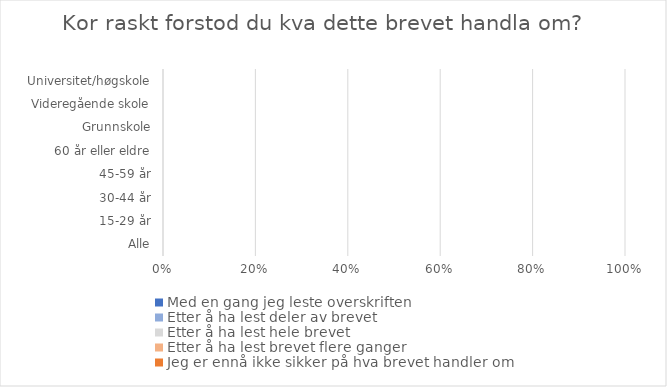
| Category | Med en gang jeg leste overskriften | Etter å ha lest deler av brevet | Etter å ha lest hele brevet | Etter å ha lest brevet flere ganger | Jeg er ennå ikke sikker på hva brevet handler om |
|---|---|---|---|---|---|
| Alle | 0 | 0 | 0 | 0 | 0 |
| 15-29 år | 0 | 0 | 0 | 0 | 0 |
| 30-44 år | 0 | 0 | 0 | 0 | 0 |
| 45-59 år | 0 | 0 | 0 | 0 | 0 |
| 60 år eller eldre | 0 | 0 | 0 | 0 | 0 |
| Grunnskole | 0 | 0 | 0 | 0 | 0 |
| Videregående skole | 0 | 0 | 0 | 0 | 0 |
| Universitet/høgskole | 0 | 0 | 0 | 0 | 0 |